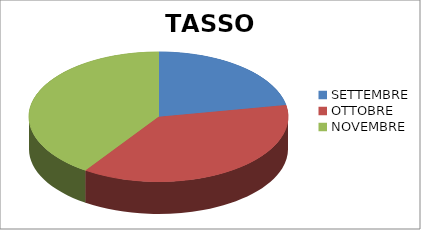
| Category | TASSO ASSENZE |
|---|---|
| SETTEMBRE | 0.048 |
| OTTOBRE | 0.081 |
| NOVEMBRE | 0.088 |